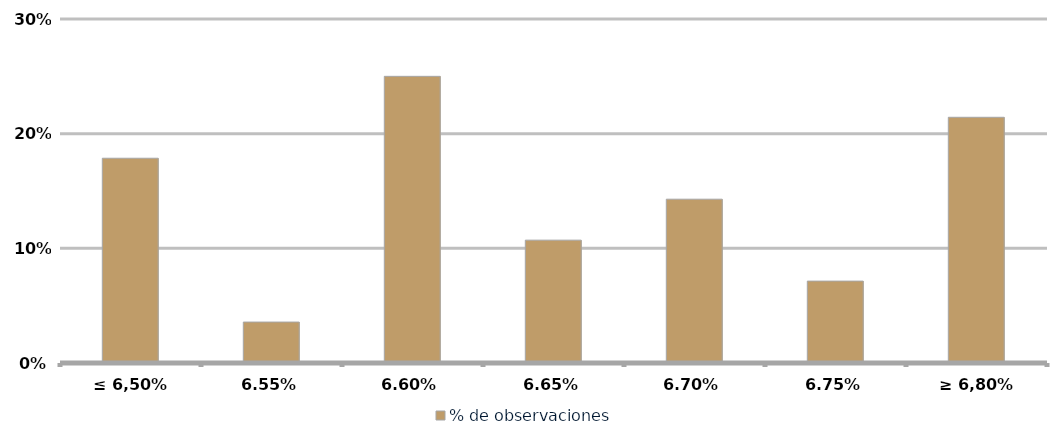
| Category | % de observaciones  |
|---|---|
| ≤ 6,50% | 0.179 |
| 6,55% | 0.036 |
| 6,60% | 0.25 |
| 6,65% | 0.107 |
| 6,70% | 0.143 |
| 6,75% | 0.071 |
| ≥ 6,80% | 0.214 |